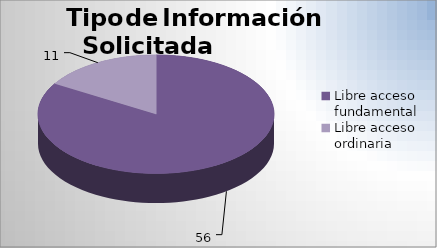
| Category | Series 0 |
|---|---|
| Libre acceso fundamental | 56 |
| Libre acceso ordinaria  | 11 |